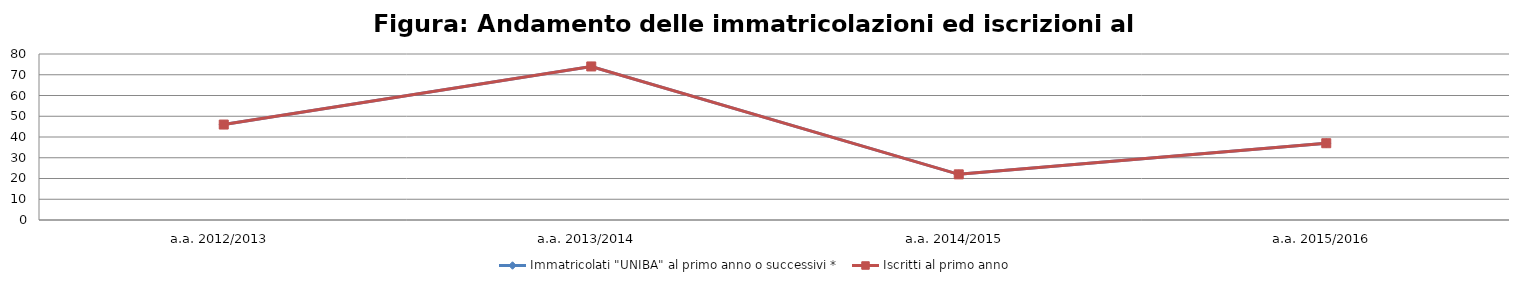
| Category | Immatricolati "UNIBA" al primo anno o successivi * | Iscritti al primo anno  |
|---|---|---|
| a.a. 2012/2013 | 46 | 46 |
| a.a. 2013/2014 | 74 | 74 |
| a.a. 2014/2015 | 22 | 22 |
| a.a. 2015/2016 | 37 | 37 |